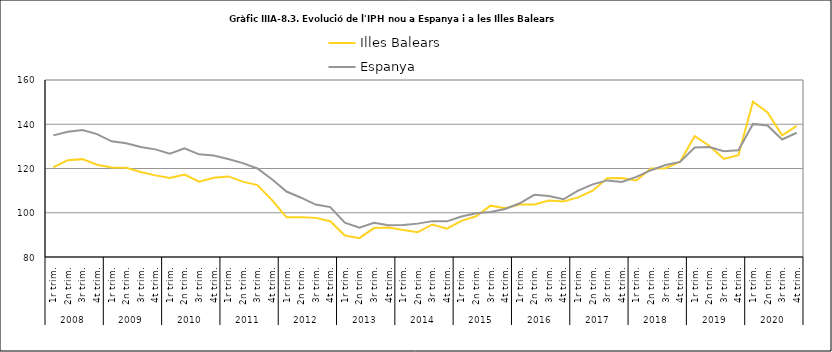
| Category | Illes Balears | Espanya |
|---|---|---|
| 0 | 120.554 | 134.966 |
| 1 | 123.741 | 136.652 |
| 2 | 124.234 | 137.382 |
| 3 | 121.722 | 135.526 |
| 4 | 120.488 | 132.281 |
| 5 | 120.311 | 131.365 |
| 6 | 118.46 | 129.71 |
| 7 | 116.897 | 128.647 |
| 8 | 115.668 | 126.703 |
| 9 | 117.25 | 129.118 |
| 10 | 114.061 | 126.395 |
| 11 | 115.816 | 125.903 |
| 12 | 116.422 | 124.259 |
| 13 | 114.074 | 122.445 |
| 14 | 112.521 | 120.016 |
| 15 | 105.768 | 115.139 |
| 16 | 97.957 | 109.595 |
| 17 | 97.963 | 106.796 |
| 18 | 97.684 | 103.702 |
| 19 | 96.148 | 102.554 |
| 20 | 89.692 | 95.538 |
| 21 | 88.52 | 93.275 |
| 22 | 93.079 | 95.459 |
| 23 | 93.362 | 94.356 |
| 24 | 92.2 | 94.496 |
| 25 | 91.246 | 95.083 |
| 26 | 94.708 | 96.21 |
| 27 | 92.823 | 96.12 |
| 28 | 96.341 | 98.268 |
| 29 | 98.402 | 99.726 |
| 30 | 103.204 | 100.328 |
| 31 | 102.053 | 101.678 |
| 32 | 103.758 | 104.284 |
| 33 | 103.784 | 108.105 |
| 34 | 105.529 | 107.605 |
| 35 | 105.05 | 106.098 |
| 36 | 106.956 | 110.016 |
| 37 | 109.992 | 112.835 |
| 38 | 115.567 | 114.619 |
| 39 | 115.688 | 113.902 |
| 40 | 114.6 | 116.24 |
| 41 | 119.979 | 119.23 |
| 42 | 120.1 | 121.6 |
| 43 | 123.1 | 123 |
| 44 | 134.602 | 129.523 |
| 45 | 130.3 | 129.72 |
| 46 | 124.378 | 127.787 |
| 47 | 126.037 | 128.285 |
| 48 | 150.176 | 140.144 |
| 49 | 145.381 | 139.4 |
| 50 | 134.967 | 133.093 |
| 51 | 139.228 | 136.156 |